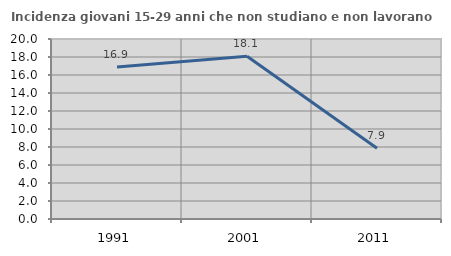
| Category | Incidenza giovani 15-29 anni che non studiano e non lavorano  |
|---|---|
| 1991.0 | 16.883 |
| 2001.0 | 18.085 |
| 2011.0 | 7.865 |